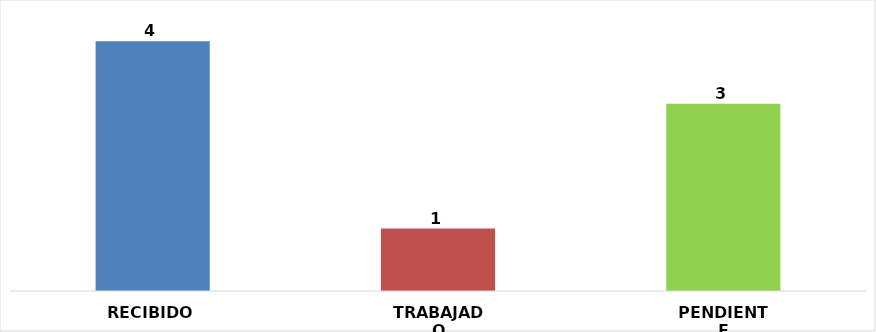
| Category | RECIBIDO |
|---|---|
| RECIBIDO | 4 |
| TRABAJADO | 1 |
| PENDIENTE | 3 |